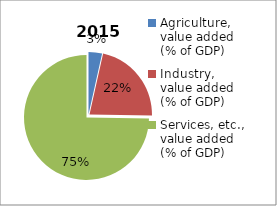
| Category | 2015 |
|---|---|
| Agriculture, value added (% of GDP)  | 3.496 |
| Industry, value added (% of GDP) | 21.736 |
| Services, etc., value added (% of GDP) | 74.769 |